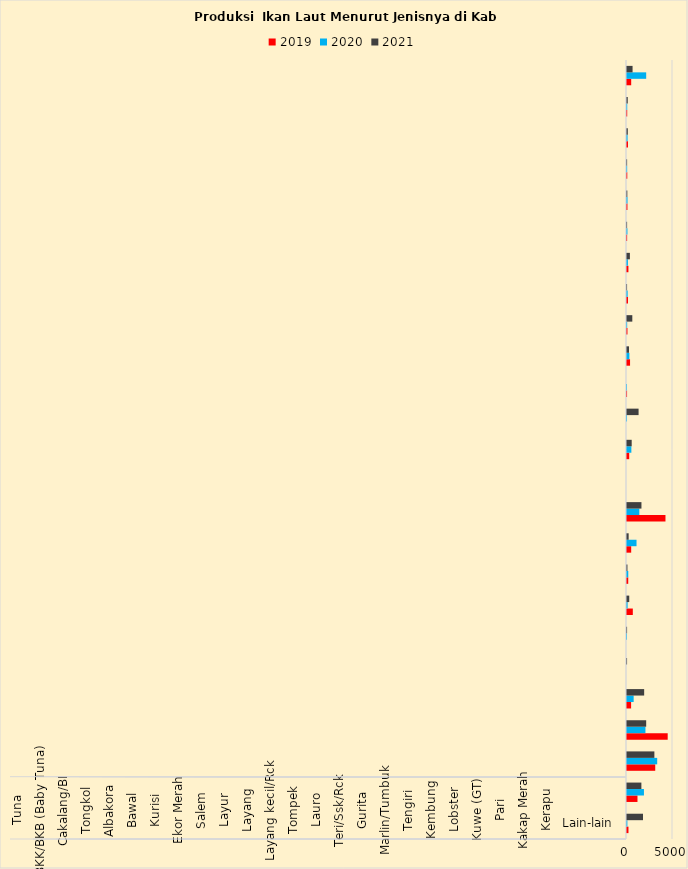
| Category | 2019 | 2020 | 2021 |
|---|---|---|---|
| Tuna | 159.68 | 40.524 | 1740.977 |
| BKK/BKB (Baby Tuna) | 1139.04 | 1842.387 | 1563.435 |
| Cakalang/BI | 3069.09 | 3282.472 | 2975.996 |
| Tongkol | 4423.78 | 2004.833 | 2085.45 |
| Albakora | 445.41 | 723.321 | 1865.339 |
| Bawal | 0 | 0 | 7.035 |
| Kurisi | 0 | 0.898 | 8.33 |
| Ekor Merah | 632.58 | 66.146 | 243.851 |
| Salem | 134.08 | 137.924 | 46.71 |
| Layur | 455.09 | 1035.535 | 180.295 |
| Layang | 4181.79 | 1340.206 | 1571.117 |
| Layang kecil/Rck | 0 | 0 | 0 |
| Tompek | 240.91 | 474.405 | 510.844 |
| Lauro | 0 | 2.9 | 1258.948 |
| Teri/Ssk/Rck | 6.65 | 0.9 | 0 |
| Gurita | 332.28 | 260.693 | 217.123 |
| Marlin/Tumbuk | 48.93 | 16.912 | 577.345 |
| Tengiri | 107.93 | 70.192 | 7.806 |
| Kembung | 153.85 | 98.27 | 314.145 |
| Lobster | 14.4 | 47.917 | 10.942 |
| Kuwe (GT) | 47.6 | 57.195 | 35.436 |
| Pari | 30.43 | 17.204 | 12.099 |
| Kakap Merah | 108.24 | 62.544 | 89.791 |
| Kerapu | 23.11 | 24.475 | 82.39 |
| Lain-lain | 455.41 | 2085.499 | 605.33 |